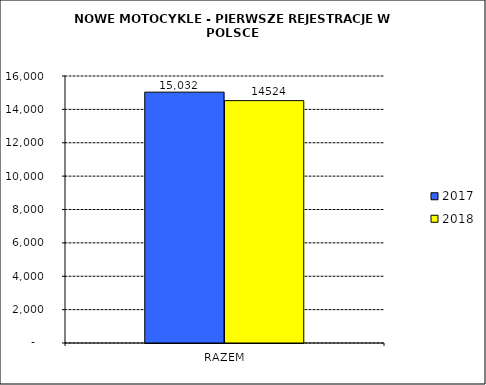
| Category | 2017 | 2018 |
|---|---|---|
| RAZEM | 15032 | 14524 |